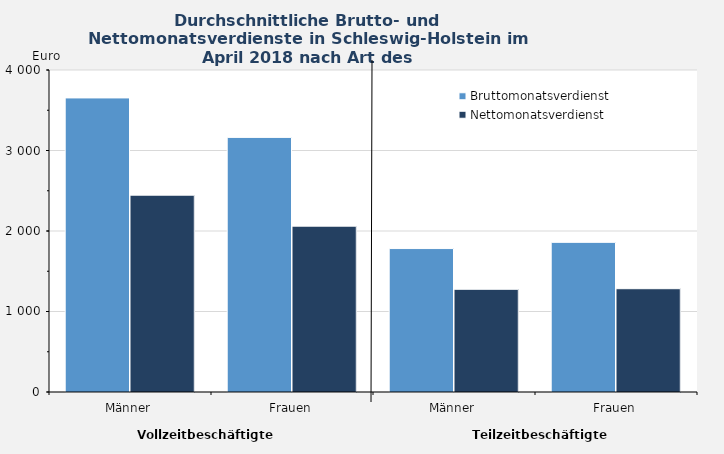
| Category | Bruttomonatsverdienst | Nettomonatsverdienst |
|---|---|---|
| Männer | 3653 | 2445 |
| Frauen | 3163 | 2060 |
| Männer | 1782 | 1276 |
| Frauen | 1859 | 1283 |